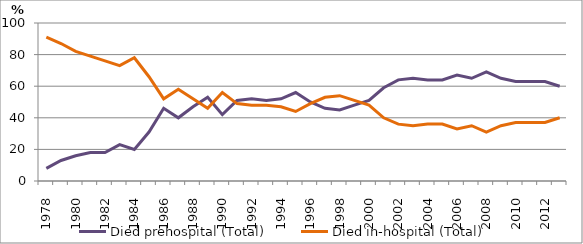
| Category | Died prehospital (Total) | Died in-hospital (Total) |
|---|---|---|
| 1978.0 | 8 | 91 |
| 1979.0 | 13 | 87 |
| 1980.0 | 16 | 82 |
| 1981.0 | 18 | 79 |
| 1982.0 | 18 | 76 |
| 1983.0 | 23 | 73 |
| 1984.0 | 20 | 78 |
| 1985.0 | 31 | 66 |
| 1986.0 | 46 | 52 |
| 1987.0 | 40 | 58 |
| 1988.0 | 47 | 52 |
| 1989.0 | 53 | 46 |
| 1990.0 | 42 | 56 |
| 1991.0 | 51 | 49 |
| 1992.0 | 52 | 48 |
| 1993.0 | 51 | 48 |
| 1994.0 | 52 | 47 |
| 1995.0 | 56 | 44 |
| 1996.0 | 50 | 49 |
| 1997.0 | 46 | 53 |
| 1998.0 | 45 | 54 |
| 1999.0 | 48 | 51 |
| 2000.0 | 51 | 48 |
| 2001.0 | 59 | 40 |
| 2002.0 | 64 | 36 |
| 2003.0 | 65 | 35 |
| 2004.0 | 64 | 36 |
| 2005.0 | 64 | 36 |
| 2006.0 | 67 | 33 |
| 2007.0 | 65 | 35 |
| 2008.0 | 69 | 31 |
| 2009.0 | 65 | 35 |
| 2010.0 | 63 | 37 |
| 2011.0 | 63 | 37 |
| 2012.0 | 63 | 37 |
| 2013.0 | 60 | 40 |